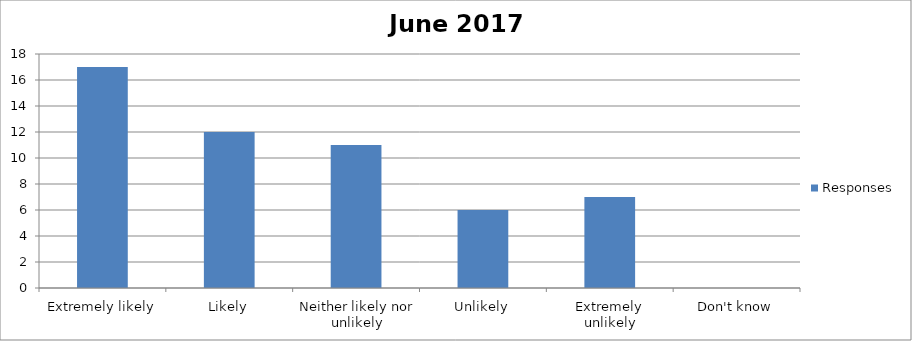
| Category | Responses |
|---|---|
| Extremely likely | 17 |
| Likely | 12 |
| Neither likely nor unlikely | 11 |
| Unlikely | 6 |
| Extremely unlikely | 7 |
| Don't know | 0 |